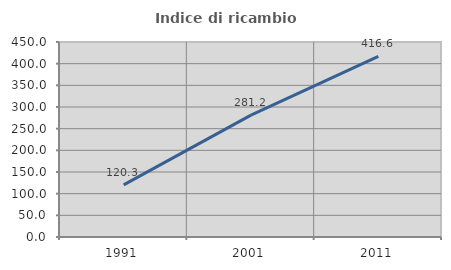
| Category | Indice di ricambio occupazionale  |
|---|---|
| 1991.0 | 120.253 |
| 2001.0 | 281.197 |
| 2011.0 | 416.598 |